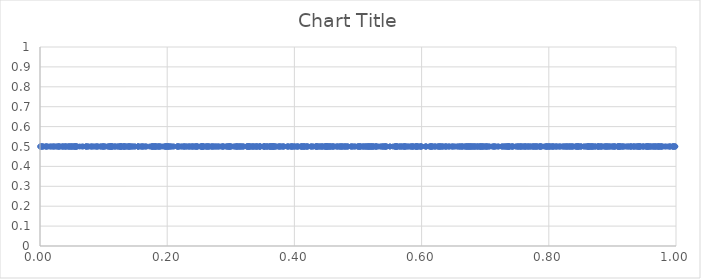
| Category | Series 0 |
|---|---|
| 0.316140277202945 | 0.5 |
| 0.8279138849072092 | 0.5 |
| 0.07573661906130091 | 0.5 |
| 0.7626178492269363 | 0.5 |
| 0.822713779529145 | 0.5 |
| 0.31337007644298664 | 0.5 |
| 0.8470968576617784 | 0.5 |
| 0.10934260965858733 | 0.5 |
| 0.0005317915554668984 | 0.5 |
| 0.14213396767202813 | 0.5 |
| 0.15393947768498406 | 0.5 |
| 0.8318170048011582 | 0.5 |
| 0.4055333368696694 | 0.5 |
| 0.8964725374382734 | 0.5 |
| 0.4124949212350675 | 0.5 |
| 0.6269306486043786 | 0.5 |
| 0.02969664363627822 | 0.5 |
| 0.7960819146087856 | 0.5 |
| 0.48888330379299805 | 0.5 |
| 0.3601915418457101 | 0.5 |
| 0.9725109551866856 | 0.5 |
| 0.6818728144339402 | 0.5 |
| 0.9691249099071847 | 0.5 |
| 0.2399912373602332 | 0.5 |
| 0.3775000497913402 | 0.5 |
| 0.36310135948029165 | 0.5 |
| 0.12678914746605974 | 0.5 |
| 0.36455411007863514 | 0.5 |
| 0.15450205476449252 | 0.5 |
| 0.3524420897235542 | 0.5 |
| 0.7871711699481113 | 0.5 |
| 0.5924314033241872 | 0.5 |
| 0.05385279226747142 | 0.5 |
| 0.3605053975590752 | 0.5 |
| 0.36723770806968437 | 0.5 |
| 0.696950930217932 | 0.5 |
| 0.8257572212418393 | 0.5 |
| 0.9781356905621928 | 0.5 |
| 0.5736519106770857 | 0.5 |
| 0.615224037936145 | 0.5 |
| 0.8824328500503711 | 0.5 |
| 0.03967489604485075 | 0.5 |
| 0.997676399623543 | 0.5 |
| 0.9113212070997144 | 0.5 |
| 0.33393525319278883 | 0.5 |
| 0.1538942341062821 | 0.5 |
| 0.25533681599372426 | 0.5 |
| 0.3290314769214262 | 0.5 |
| 0.45127129400800037 | 0.5 |
| 0.36130529424438496 | 0.5 |
| 0.9227691645608844 | 0.5 |
| 0.29874201656155874 | 0.5 |
| 0.5855418560036731 | 0.5 |
| 0.3964047594638409 | 0.5 |
| 0.3620487057161199 | 0.5 |
| 0.46690113072019823 | 0.5 |
| 0.1256167879357144 | 0.5 |
| 0.3660863616125365 | 0.5 |
| 0.9169181905783852 | 0.5 |
| 0.6689538304348907 | 0.5 |
| 0.17668724219167276 | 0.5 |
| 0.5972588871614944 | 0.5 |
| 0.9242102633956718 | 0.5 |
| 0.8778800101147995 | 0.5 |
| 0.16225232621905306 | 0.5 |
| 0.48236317181117483 | 0.5 |
| 0.9568267495728185 | 0.5 |
| 0.5781733888205093 | 0.5 |
| 0.13792655113744867 | 0.5 |
| 0.8289456576640143 | 0.5 |
| 0.6585463274409855 | 0.5 |
| 0.747861843408552 | 0.5 |
| 0.7669690341061742 | 0.5 |
| 0.67327608221354 | 0.5 |
| 0.3509346573340577 | 0.5 |
| 0.7650400081383985 | 0.5 |
| 0.09573186216346197 | 0.5 |
| 0.7518797017340856 | 0.5 |
| 0.021407270458848382 | 0.5 |
| 0.05630687909899246 | 0.5 |
| 0.6141088450486518 | 0.5 |
| 0.14088131678265492 | 0.5 |
| 0.577751396331167 | 0.5 |
| 0.7324984228716216 | 0.5 |
| 0.6291284639585224 | 0.5 |
| 0.8791205211985628 | 0.5 |
| 0.6789180747003921 | 0.5 |
| 0.36755625615616294 | 0.5 |
| 0.8101696192863093 | 0.5 |
| 0.6952028399417156 | 0.5 |
| 0.7998749369911501 | 0.5 |
| 0.612051724857891 | 0.5 |
| 0.46791054609981264 | 0.5 |
| 0.5392998957609471 | 0.5 |
| 0.10670329086302799 | 0.5 |
| 0.03230615607682141 | 0.5 |
| 0.7260658541931262 | 0.5 |
| 0.7374358839612665 | 0.5 |
| 0.5548251859264313 | 0.5 |
| 0.7069484751853464 | 0.5 |
| 0.591345463056026 | 0.5 |
| 0.3156931400315667 | 0.5 |
| 0.3412863963736914 | 0.5 |
| 0.8070580480719562 | 0.5 |
| 0.4914526581531925 | 0.5 |
| 0.2978107410566557 | 0.5 |
| 0.2936695657990688 | 0.5 |
| 0.479790614515731 | 0.5 |
| 0.4273826430607265 | 0.5 |
| 0.660850744379741 | 0.5 |
| 0.5646519809031596 | 0.5 |
| 0.34682167615578174 | 0.5 |
| 0.4608002217970881 | 0.5 |
| 0.20539378781228623 | 0.5 |
| 0.8661630510819142 | 0.5 |
| 0.3953806515226381 | 0.5 |
| 0.18177433936542875 | 0.5 |
| 0.433909954834803 | 0.5 |
| 0.17691131314909303 | 0.5 |
| 0.5912143396869772 | 0.5 |
| 0.6790502572425086 | 0.5 |
| 0.17243152791313143 | 0.5 |
| 0.5662936591502048 | 0.5 |
| 0.6530799497054955 | 0.5 |
| 0.7966665848473953 | 0.5 |
| 0.23437793290806364 | 0.5 |
| 0.9488258659349992 | 0.5 |
| 0.9151100312807979 | 0.5 |
| 0.5576650083839816 | 0.5 |
| 0.882983579485707 | 0.5 |
| 0.12154514001030403 | 0.5 |
| 0.11386585192256515 | 0.5 |
| 0.20446482674864186 | 0.5 |
| 0.8994960508437626 | 0.5 |
| 0.08522996803920102 | 0.5 |
| 0.2635528120506664 | 0.5 |
| 0.27933691404995964 | 0.5 |
| 0.08747818626609805 | 0.5 |
| 0.10259236208085509 | 0.5 |
| 0.6053917582607868 | 0.5 |
| 0.371240740135095 | 0.5 |
| 0.8166180188212842 | 0.5 |
| 0.6069228591733911 | 0.5 |
| 0.8360296935313187 | 0.5 |
| 0.13354431827767532 | 0.5 |
| 0.185329026753559 | 0.5 |
| 0.3951832068648554 | 0.5 |
| 0.42999899665993346 | 0.5 |
| 0.6284893106300841 | 0.5 |
| 0.17736118918046573 | 0.5 |
| 0.24358657732450328 | 0.5 |
| 0.8617259034832137 | 0.5 |
| 0.4111680304997748 | 0.5 |
| 0.904595455386175 | 0.5 |
| 0.887741511756658 | 0.5 |
| 0.3830320481648861 | 0.5 |
| 0.9168479667278027 | 0.5 |
| 0.774988390187212 | 0.5 |
| 0.5042257363978759 | 0.5 |
| 0.14903672058523687 | 0.5 |
| 0.4538086269268192 | 0.5 |
| 0.9682288455977281 | 0.5 |
| 0.7203172232217582 | 0.5 |
| 0.11182944061130384 | 0.5 |
| 0.24605716974904568 | 0.5 |
| 0.46959948266571183 | 0.5 |
| 0.9124236630319756 | 0.5 |
| 0.9666059256728139 | 0.5 |
| 0.22978069696937264 | 0.5 |
| 0.5591237130470653 | 0.5 |
| 0.7438777080376362 | 0.5 |
| 0.31959377128753963 | 0.5 |
| 0.38118384860600396 | 0.5 |
| 0.05437687177769657 | 0.5 |
| 0.04843445096670518 | 0.5 |
| 0.1971240276491587 | 0.5 |
| 0.516219010709172 | 0.5 |
| 0.5363404481617712 | 0.5 |
| 0.44913774485276325 | 0.5 |
| 0.47906001972383494 | 0.5 |
| 0.5686437681955675 | 0.5 |
| 0.026661896115045436 | 0.5 |
| 0.25284699319672077 | 0.5 |
| 0.010029161423310673 | 0.5 |
| 0.9973909648196548 | 0.5 |
| 0.13573011931906787 | 0.5 |
| 0.7788188194291551 | 0.5 |
| 0.890603009700622 | 0.5 |
| 0.6885428647358148 | 0.5 |
| 0.5325888677255436 | 0.5 |
| 0.47504083521473095 | 0.5 |
| 0.7005563068936658 | 0.5 |
| 0.2878504071984148 | 0.5 |
| 0.5109727022899717 | 0.5 |
| 0.09019701218086529 | 0.5 |
| 0.5009855533035981 | 0.5 |
| 0.567460471156036 | 0.5 |
| 0.9655591100673394 | 0.5 |
| 0.5432780068324927 | 0.5 |
| 0.0759904898881344 | 0.5 |
| 0.7981756856362207 | 0.5 |
| 0.06230865624371762 | 0.5 |
| 0.2271772520274663 | 0.5 |
| 0.8434453180996347 | 0.5 |
| 0.8035566281079249 | 0.5 |
| 0.3793941150720944 | 0.5 |
| 0.9721730342241098 | 0.5 |
| 0.19517414076173878 | 0.5 |
| 0.45168000256443896 | 0.5 |
| 0.36655227107460164 | 0.5 |
| 0.5648936469778881 | 0.5 |
| 0.054738096291129246 | 0.5 |
| 0.11187864608645648 | 0.5 |
| 0.3636568328319306 | 0.5 |
| 0.6753131502282518 | 0.5 |
| 0.9718046303355279 | 0.5 |
| 0.18027273102541608 | 0.5 |
| 0.2322436193639641 | 0.5 |
| 0.04555509438477778 | 0.5 |
| 0.8739809895687881 | 0.5 |
| 0.39689181687767416 | 0.5 |
| 0.41004565207273536 | 0.5 |
| 0.353882408702347 | 0.5 |
| 0.1104497366530478 | 0.5 |
| 0.9949201838676913 | 0.5 |
| 0.7695929208059483 | 0.5 |
| 0.9340137165224598 | 0.5 |
| 0.7792491616736487 | 0.5 |
| 0.27662998260195737 | 0.5 |
| 0.09007322600079604 | 0.5 |
| 0.2558528983058712 | 0.5 |
| 0.7717517681351032 | 0.5 |
| 0.732556472379286 | 0.5 |
| 0.15798762103831276 | 0.5 |
| 0.22685877771553697 | 0.5 |
| 0.8409454384222769 | 0.5 |
| 0.03651709775038059 | 0.5 |
| 0.9762809202396978 | 0.5 |
| 0.27447926195898453 | 0.5 |
| 0.9297789600405282 | 0.5 |
| 0.2549843367880723 | 0.5 |
| 0.6489778309621204 | 0.5 |
| 0.3251956439102862 | 0.5 |
| 0.7318369034594073 | 0.5 |
| 0.6132890953720375 | 0.5 |
| 0.7894453544786293 | 0.5 |
| 0.6955551969750078 | 0.5 |
| 0.4150780731044358 | 0.5 |
| 0.6723216537432367 | 0.5 |
| 0.19841158118506996 | 0.5 |
| 0.767289870188733 | 0.5 |
| 0.9409231746535831 | 0.5 |
| 0.003523435462028379 | 0.5 |
| 0.44309285759618244 | 0.5 |
| 0.8435182058364197 | 0.5 |
| 0.7006295064520656 | 0.5 |
| 0.0018692736230974116 | 0.5 |
| 0.5612966472762296 | 0.5 |
| 0.4117049188372208 | 0.5 |
| 0.8367424565724454 | 0.5 |
| 0.8058549634088027 | 0.5 |
| 0.6833418611031782 | 0.5 |
| 0.7023926120156478 | 0.5 |
| 0.45259652057550637 | 0.5 |
| 0.9426826055066293 | 0.5 |
| 0.5227848802645618 | 0.5 |
| 0.7706080341628062 | 0.5 |
| 0.4374893059187981 | 0.5 |
| 0.010882435151053693 | 0.5 |
| 0.8897505034411495 | 0.5 |
| 0.1319298035868781 | 0.5 |
| 0.11462385764754279 | 0.5 |
| 0.05745548047257154 | 0.5 |
| 0.9206031566650251 | 0.5 |
| 0.7364658583821885 | 0.5 |
| 0.17804470803185213 | 0.5 |
| 0.6765115564208252 | 0.5 |
| 0.9544233294725676 | 0.5 |
| 0.7060426436526935 | 0.5 |
| 0.47392230665983825 | 0.5 |
| 0.357005146770056 | 0.5 |
| 0.19738562575561225 | 0.5 |
| 0.2995311442119828 | 0.5 |
| 0.6422675811546292 | 0.5 |
| 0.12963382785169542 | 0.5 |
| 0.48382543243173126 | 0.5 |
| 0.5287606387741778 | 0.5 |
| 0.29581899387109867 | 0.5 |
| 0.5128861243604853 | 0.5 |
| 0.36594491340307844 | 0.5 |
| 0.9431452956477482 | 0.5 |
| 0.4768729389122992 | 0.5 |
| 0.23875929426965448 | 0.5 |
| 0.4751296996094133 | 0.5 |
| 0.11250361268117459 | 0.5 |
| 0.41454695548132536 | 0.5 |
| 0.24003011289041598 | 0.5 |
| 0.16279918068976873 | 0.5 |
| 0.11720714795799225 | 0.5 |
| 0.47098129743390094 | 0.5 |
| 0.7507223586433711 | 0.5 |
| 0.13081305397113507 | 0.5 |
| 0.37490806202593774 | 0.5 |
| 0.8670572174341187 | 0.5 |
| 0.0730244338200956 | 0.5 |
| 0.6251174377583888 | 0.5 |
| 0.7857018884016823 | 0.5 |
| 0.8775943955829213 | 0.5 |
| 0.6809414388790489 | 0.5 |
| 0.05219473108009365 | 0.5 |
| 0.507086485362239 | 0.5 |
| 0.5237284620616207 | 0.5 |
| 0.9556883839429868 | 0.5 |
| 0.7877269523980381 | 0.5 |
| 0.6268289488610428 | 0.5 |
| 0.1094158696131512 | 0.5 |
| 0.4101993475065703 | 0.5 |
| 0.8315842226872262 | 0.5 |
| 0.7171634489153864 | 0.5 |
| 0.33534978453458797 | 0.5 |
| 0.12380756074044985 | 0.5 |
| 0.3779569079036612 | 0.5 |
| 0.9130879104899315 | 0.5 |
| 0.6147364601637778 | 0.5 |
| 0.5436797469555968 | 0.5 |
| 0.5224528605830396 | 0.5 |
| 0.22304553582778208 | 0.5 |
| 0.05585119006408945 | 0.5 |
| 0.9950234366811046 | 0.5 |
| 0.20082118868887544 | 0.5 |
| 0.8685541951676776 | 0.5 |
| 0.6475454994433284 | 0.5 |
| 0.18225400315286788 | 0.5 |
| 0.9022842071603825 | 0.5 |
| 0.5444888919645653 | 0.5 |
| 0.9986922630739183 | 0.5 |
| 0.2945660310203435 | 0.5 |
| 0.36214109265428107 | 0.5 |
| 0.13987916227150643 | 0.5 |
| 0.4725917003837471 | 0.5 |
| 0.9756665497942039 | 0.5 |
| 0.25417839534662023 | 0.5 |
| 0.6342607824219738 | 0.5 |
| 0.047013893880615276 | 0.5 |
| 0.8968308935220303 | 0.5 |
| 0.009457951995998415 | 0.5 |
| 0.3106012162400632 | 0.5 |
| 0.3252141394996444 | 0.5 |
| 0.07969457426846405 | 0.5 |
| 0.3903295640733685 | 0.5 |
| 0.6845024536712324 | 0.5 |
| 0.39343144482681724 | 0.5 |
| 0.957737446356155 | 0.5 |
| 0.4737111795613128 | 0.5 |
| 0.6895906760380528 | 0.5 |
| 0.12534529924516213 | 0.5 |
| 0.20852638064632578 | 0.5 |
| 0.2016626366672779 | 0.5 |
| 0.7824317474433724 | 0.5 |
| 0.5256456403951164 | 0.5 |
| 0.5987635616622865 | 0.5 |
| 0.8485257280089122 | 0.5 |
| 0.5197171542844282 | 0.5 |
| 0.8432211050342873 | 0.5 |
| 0.18205826478989395 | 0.5 |
| 0.21738135422478455 | 0.5 |
| 0.21597629229433013 | 0.5 |
| 0.01665574370557743 | 0.5 |
| 0.574850860606657 | 0.5 |
| 0.012717600016952102 | 0.5 |
| 0.7637231150425066 | 0.5 |
| 0.42049142667674266 | 0.5 |
| 0.03677574097195069 | 0.5 |
| 0.8677308622452121 | 0.5 |
| 0.29154224687816754 | 0.5 |
| 0.7929597465123112 | 0.5 |
| 0.6689346683040283 | 0.5 |
| 0.9039354960510008 | 0.5 |
| 0.8614855972829443 | 0.5 |
| 0.6607823786637489 | 0.5 |
| 0.960971995391843 | 0.5 |
| 0.022724627774075246 | 0.5 |
| 0.9536010667504732 | 0.5 |
| 0.4336695072886073 | 0.5 |
| 0.00567768030934368 | 0.5 |
| 0.34351036840774396 | 0.5 |
| 0.3056933774449079 | 0.5 |
| 0.17625893527338277 | 0.5 |
| 0.07292316377851726 | 0.5 |
| 0.3902958754251744 | 0.5 |
| 0.26559009765746544 | 0.5 |
| 0.38964720087830185 | 0.5 |
| 0.8261718840102028 | 0.5 |
| 0.8590479588319061 | 0.5 |
| 0.9740641201424202 | 0.5 |
| 0.000542940953940585 | 0.5 |
| 0.13302336057132613 | 0.5 |
| 0.7427954997924764 | 0.5 |
| 0.7805619582323498 | 0.5 |
| 0.3121951679690973 | 0.5 |
| 0.6883191072536679 | 0.5 |
| 0.2034725466620051 | 0.5 |
| 0.27035074954992766 | 0.5 |
| 0.21625593721880043 | 0.5 |
| 0.9821419539732399 | 0.5 |
| 0.8025724843114994 | 0.5 |
| 0.28685622363330576 | 0.5 |
| 0.8594142013524038 | 0.5 |
| 0.6635116809416659 | 0.5 |
| 0.27059031196686 | 0.5 |
| 0.7976303072279542 | 0.5 |
| 0.6966281565879382 | 0.5 |
| 0.9908394204667579 | 0.5 |
| 0.6780185035228592 | 0.5 |
| 0.252792671889395 | 0.5 |
| 0.14908447106793343 | 0.5 |
| 0.8631869908817871 | 0.5 |
| 0.9842778848090014 | 0.5 |
| 0.5301311945071031 | 0.5 |
| 0.36851458620298616 | 0.5 |
| 0.9269824683853033 | 0.5 |
| 0.8724359242888429 | 0.5 |
| 0.13196367706269663 | 0.5 |
| 0.6207514858482324 | 0.5 |
| 0.33157723277029294 | 0.5 |
| 0.028600947433907398 | 0.5 |
| 0.4903086009771441 | 0.5 |
| 0.9026339747066547 | 0.5 |
| 0.7385045469378068 | 0.5 |
| 0.5136653441654301 | 0.5 |
| 0.1845245329039792 | 0.5 |
| 0.4488823782158753 | 0.5 |
| 0.6443471921361953 | 0.5 |
| 0.674288645490064 | 0.5 |
| 0.20267012155442043 | 0.5 |
| 0.5032873972924795 | 0.5 |
| 0.5155572646944955 | 0.5 |
| 0.05095611198299599 | 0.5 |
| 0.18594618654686368 | 0.5 |
| 0.5733294625650402 | 0.5 |
| 0.4520563585018459 | 0.5 |
| 0.8913930222413581 | 0.5 |
| 0.12715759683095806 | 0.5 |
| 0.3645939137424906 | 0.5 |
| 0.9033796649548892 | 0.5 |
| 0.11805303631234876 | 0.5 |
| 0.7861488313087347 | 0.5 |
| 0.8336134119256122 | 0.5 |
| 0.1784888124095484 | 0.5 |
| 0.6775469120565247 | 0.5 |
| 0.3169129834988734 | 0.5 |
| 0.356745474676358 | 0.5 |
| 0.480421974865778 | 0.5 |
| 0.1109169569563766 | 0.5 |
| 0.5258259055178699 | 0.5 |
| 0.8223144015538953 | 0.5 |
| 0.48878353685489584 | 0.5 |
| 0.2666707917657145 | 0.5 |
| 0.8883791863746662 | 0.5 |
| 0.9406072456576429 | 0.5 |
| 0.5832743394927776 | 0.5 |
| 0.8642442213886772 | 0.5 |
| 0.40401170129315833 | 0.5 |
| 0.7341668273865775 | 0.5 |
| 0.34611001097350835 | 0.5 |
| 0.6976171826911048 | 0.5 |
| 0.1878310414212594 | 0.5 |
| 0.861797804852813 | 0.5 |
| 0.2011735891818599 | 0.5 |
| 0.815643494849891 | 0.5 |
| 0.6724053222578775 | 0.5 |
| 0.25534922042303454 | 0.5 |
| 0.8382218648312287 | 0.5 |
| 0.6157257347398405 | 0.5 |
| 0.5593717891747976 | 0.5 |
| 0.9118207874005462 | 0.5 |
| 0.9901767481316952 | 0.5 |
| 0.9693948827883279 | 0.5 |
| 0.817810318357888 | 0.5 |
| 0.5039544971669332 | 0.5 |
| 0.45127295329711425 | 0.5 |
| 0.7001829989669623 | 0.5 |
| 0.42575806316747977 | 0.5 |
| 0.45648203262024356 | 0.5 |
| 0.043658608374677055 | 0.5 |
| 0.9584106085697875 | 0.5 |
| 0.4411839678202326 | 0.5 |
| 0.281511922315442 | 0.5 |
| 0.0404876073016609 | 0.5 |
| 0.6512301424383723 | 0.5 |
| 0.6813953737550204 | 0.5 |
| 0.0399933223615172 | 0.5 |
| 0.24784439087371568 | 0.5 |
| 0.016121842888231708 | 0.5 |
| 0.1427430325439062 | 0.5 |
| 0.8127287420896371 | 0.5 |
| 0.1759902993408471 | 0.5 |
| 0.2403974874419883 | 0.5 |
| 0.2861128365159996 | 0.5 |
| 0.14364009943903988 | 0.5 |
| 0.8005931210220294 | 0.5 |
| 0.5809809031193921 | 0.5 |
| 0.30807823389610633 | 0.5 |
| 0.8618136235122765 | 0.5 |
| 0.4530273882781376 | 0.5 |
| 0.4154159175707236 | 0.5 |
| 0.9377474361477578 | 0.5 |
| 0.8055698936209067 | 0.5 |
| 0.2549022946333902 | 0.5 |
| 0.4717788681127042 | 0.5 |
| 0.6605532299500049 | 0.5 |
| 0.4842745229986868 | 0.5 |
| 0.5179061004618805 | 0.5 |
| 0.4490954263875456 | 0.5 |
| 0.9628316518479614 | 0.5 |
| 0.9639022001613513 | 0.5 |
| 0.7027742153233655 | 0.5 |
| 0.12535467463246353 | 0.5 |
| 0.5401271992489679 | 0.5 |
| 0.7156108263061361 | 0.5 |
| 0.08824641566307789 | 0.5 |
| 0.9950367898230145 | 0.5 |
| 0.4360108588550231 | 0.5 |
| 0.4361265215588682 | 0.5 |
| 0.8196595200257385 | 0.5 |
| 0.31284439419912236 | 0.5 |
| 0.49502353881851757 | 0.5 |
| 0.5585007865713417 | 0.5 |
| 0.7491819239167447 | 0.5 |
| 0.8506043389081751 | 0.5 |
| 0.5357831144891186 | 0.5 |
| 0.12825926693683887 | 0.5 |
| 0.9399628448140908 | 0.5 |
| 0.32803996431447613 | 0.5 |
| 0.7368410345390142 | 0.5 |
| 0.49996529479750595 | 0.5 |
| 0.32883815765917457 | 0.5 |
| 0.9966540570613032 | 0.5 |
| 0.27725691264172037 | 0.5 |
| 0.6426971454443089 | 0.5 |
| 0.019026104638370622 | 0.5 |
| 0.34498576290907934 | 0.5 |
| 0.542498704385789 | 0.5 |
| 0.4501192848525517 | 0.5 |
| 0.9288514831717757 | 0.5 |
| 0.23667369705640107 | 0.5 |
| 0.24683478763538813 | 0.5 |
| 0.7551482062656539 | 0.5 |
| 0.06796582938944895 | 0.5 |
| 0.9443236075291223 | 0.5 |
| 0.3099575601022373 | 0.5 |
| 0.1992153862086259 | 0.5 |
| 0.2622762360169639 | 0.5 |
| 0.9503144336054367 | 0.5 |
| 0.9759938662995388 | 0.5 |
| 0.9645187381678588 | 0.5 |
| 0.8585285943529524 | 0.5 |
| 0.7428150298038544 | 0.5 |
| 0.5862081664831009 | 0.5 |
| 0.3821826990271038 | 0.5 |
| 0.48177719125239826 | 0.5 |
| 0.3389609236918194 | 0.5 |
| 0.5688526217182813 | 0.5 |
| 0.34557233221835915 | 0.5 |
| 0.3752284768147648 | 0.5 |
| 0.9786992427787252 | 0.5 |
| 0.8701824638041783 | 0.5 |
| 0.8466675536974719 | 0.5 |
| 0.25528878753184314 | 0.5 |
| 0.9088517060441906 | 0.5 |
| 0.29663735741973396 | 0.5 |
| 0.7135057573921985 | 0.5 |
| 0.9727956640548173 | 0.5 |
| 0.05718010676931096 | 0.5 |
| 0.9104043410739782 | 0.5 |
| 0.6714003657505474 | 0.5 |
| 0.2943446387267066 | 0.5 |
| 0.12733945537568347 | 0.5 |
| 0.42598751872957696 | 0.5 |
| 0.279999644357978 | 0.5 |
| 0.80049257618774 | 0.5 |
| 0.45101337838115574 | 0.5 |
| 0.30977627618302195 | 0.5 |
| 0.5604048182819867 | 0.5 |
| 0.9528285195150307 | 0.5 |
| 0.30563544662265474 | 0.5 |
| 0.9871609396073479 | 0.5 |
| 0.9364730783501634 | 0.5 |
| 0.37612178369974847 | 0.5 |
| 0.45695441133049297 | 0.5 |
| 0.8623787530994658 | 0.5 |
| 0.8782359586277667 | 0.5 |
| 0.5175592591853772 | 0.5 |
| 0.8694359268554798 | 0.5 |
| 0.30144978339010653 | 0.5 |
| 0.136656905009915 | 0.5 |
| 0.9427142682324938 | 0.5 |
| 0.8062642716969768 | 0.5 |
| 0.049803526162151335 | 0.5 |
| 0.8807232740422994 | 0.5 |
| 0.7590215237639973 | 0.5 |
| 0.460414446344774 | 0.5 |
| 0.1612074275432619 | 0.5 |
| 0.2563751573631461 | 0.5 |
| 0.571847479815835 | 0.5 |
| 0.4490807746717145 | 0.5 |
| 0.6206892348511307 | 0.5 |
| 0.09874683396995099 | 0.5 |
| 0.1962794304207608 | 0.5 |
| 0.7358766882006063 | 0.5 |
| 0.599265712660927 | 0.5 |
| 0.36689443588963155 | 0.5 |
| 0.46643788458489743 | 0.5 |
| 0.5078476466515423 | 0.5 |
| 0.861742236798262 | 0.5 |
| 0.1814161162502631 | 0.5 |
| 0.3568475123810497 | 0.5 |
| 0.7593594487017141 | 0.5 |
| 0.46149078069264116 | 0.5 |
| 0.8461477149065413 | 0.5 |
| 0.40204067801241294 | 0.5 |
| 0.20109054029594597 | 0.5 |
| 0.6169636519112254 | 0.5 |
| 0.8819666999248547 | 0.5 |
| 0.5903071784316392 | 0.5 |
| 0.46323121463156236 | 0.5 |
| 0.6264358627501254 | 0.5 |
| 0.7570716954806309 | 0.5 |
| 0.9545685513987864 | 0.5 |
| 0.13979194332906442 | 0.5 |
| 0.09678310102746612 | 0.5 |
| 0.167370003404001 | 0.5 |
| 0.5753188212306872 | 0.5 |
| 0.5936049446809027 | 0.5 |
| 0.1460013750948279 | 0.5 |
| 0.810988992075109 | 0.5 |
| 0.3531290915171009 | 0.5 |
| 0.6219050781121293 | 0.5 |
| 0.3656215647638654 | 0.5 |
| 0.9082864000622457 | 0.5 |
| 0.8862924637134654 | 0.5 |
| 0.9344083693299922 | 0.5 |
| 0.855471507416243 | 0.5 |
| 0.26540434196440243 | 0.5 |
| 0.8692457346764216 | 0.5 |
| 0.894965338270665 | 0.5 |
| 0.44557891169815267 | 0.5 |
| 0.773301467045456 | 0.5 |
| 0.9087126764048409 | 0.5 |
| 0.7145600478624436 | 0.5 |
| 0.8471288322877059 | 0.5 |
| 0.3199078942712197 | 0.5 |
| 0.025193050940178874 | 0.5 |
| 0.7870910944910237 | 0.5 |
| 0.7391467296097219 | 0.5 |
| 0.18783322842393102 | 0.5 |
| 0.7751574536263924 | 0.5 |
| 0.09083632802539021 | 0.5 |
| 0.5449208830287551 | 0.5 |
| 0.192324524122231 | 0.5 |
| 0.8339134655176463 | 0.5 |
| 0.615841953460827 | 0.5 |
| 0.034767161228520305 | 0.5 |
| 0.43599050493069014 | 0.5 |
| 0.327979479276012 | 0.5 |
| 0.9530772689433317 | 0.5 |
| 0.36258431145771386 | 0.5 |
| 0.18799683699777625 | 0.5 |
| 0.29834081062123563 | 0.5 |
| 0.8452563216725639 | 0.5 |
| 0.9730102501154803 | 0.5 |
| 0.45657914041196934 | 0.5 |
| 0.9560849478474749 | 0.5 |
| 0.3376054498537969 | 0.5 |
| 0.9440597405744916 | 0.5 |
| 0.8773238201705812 | 0.5 |
| 0.670909542254862 | 0.5 |
| 0.663427273538356 | 0.5 |
| 0.08061138808826895 | 0.5 |
| 0.46023456891842596 | 0.5 |
| 0.6390375809911464 | 0.5 |
| 0.09912329760015215 | 0.5 |
| 0.8452312249902798 | 0.5 |
| 0.752433603461801 | 0.5 |
| 0.6570188596958103 | 0.5 |
| 0.040332811524051215 | 0.5 |
| 0.3090337274146492 | 0.5 |
| 0.8556461814306912 | 0.5 |
| 0.8784238669411869 | 0.5 |
| 0.5867508723332818 | 0.5 |
| 0.5580792255340754 | 0.5 |
| 0.1269894239128646 | 0.5 |
| 0.6919743516276968 | 0.5 |
| 0.11139623242407981 | 0.5 |
| 0.4426752390801789 | 0.5 |
| 0.08309682708944666 | 0.5 |
| 0.6002600826089894 | 0.5 |
| 0.7120946732420497 | 0.5 |
| 0.09840897708693919 | 0.5 |
| 0.8282340329710871 | 0.5 |
| 0.8727367535615619 | 0.5 |
| 0.7366292384383597 | 0.5 |
| 0.9325070445569558 | 0.5 |
| 0.7263825766291627 | 0.5 |
| 0.865596899632027 | 0.5 |
| 0.04904107138681768 | 0.5 |
| 0.0027971336390596457 | 0.5 |
| 0.27237805480185695 | 0.5 |
| 0.04545472535573636 | 0.5 |
| 0.9988596910345873 | 0.5 |
| 0.6649184740623468 | 0.5 |
| 0.6331378852032591 | 0.5 |
| 0.6836347865702013 | 0.5 |
| 0.8299228002364695 | 0.5 |
| 0.7623279173563501 | 0.5 |
| 0.8512220860265206 | 0.5 |
| 0.7342637821213915 | 0.5 |
| 0.5924381164277838 | 0.5 |
| 0.5201844035501217 | 0.5 |
| 0.021136971635945634 | 0.5 |
| 0.14015347546621282 | 0.5 |
| 0.19853269805166684 | 0.5 |
| 0.592485887443751 | 0.5 |
| 0.6927900843296313 | 0.5 |
| 0.909966067779536 | 0.5 |
| 0.5167901602805655 | 0.5 |
| 0.6701243581574531 | 0.5 |
| 0.05399022594136471 | 0.5 |
| 0.6927543224556454 | 0.5 |
| 0.9291604261528342 | 0.5 |
| 0.12793574173644562 | 0.5 |
| 0.8768251174694672 | 0.5 |
| 0.8074377171102387 | 0.5 |
| 0.09990898949115778 | 0.5 |
| 0.7423343917378555 | 0.5 |
| 0.5218086740303247 | 0.5 |
| 0.6859619868463702 | 0.5 |
| 0.6376612442862204 | 0.5 |
| 0.3517764882456267 | 0.5 |
| 0.989894739015344 | 0.5 |
| 0.7758777445470093 | 0.5 |
| 0.7417465928337952 | 0.5 |
| 0.29740790837893427 | 0.5 |
| 0.7046955586525111 | 0.5 |
| 0.11050504716090681 | 0.5 |
| 0.3992928214160514 | 0.5 |
| 0.5287975453690635 | 0.5 |
| 0.2976829408557755 | 0.5 |
| 0.5025437949750541 | 0.5 |
| 0.2553444216354679 | 0.5 |
| 0.8343942459403282 | 0.5 |
| 0.8243591574676843 | 0.5 |
| 0.5984262709202344 | 0.5 |
| 0.6375688301932834 | 0.5 |
| 0.7803709345959163 | 0.5 |
| 0.3704831947150955 | 0.5 |
| 0.05690435959918827 | 0.5 |
| 0.9333068156184855 | 0.5 |
| 0.7769400834416339 | 0.5 |
| 0.35736017138381415 | 0.5 |
| 0.11235528255289973 | 0.5 |
| 0.8374199536919396 | 0.5 |
| 0.33362493239832225 | 0.5 |
| 0.4391607539068758 | 0.5 |
| 0.4544375795828546 | 0.5 |
| 0.13259441841961905 | 0.5 |
| 0.42040774323114005 | 0.5 |
| 0.5600138344027378 | 0.5 |
| 0.3672605434654068 | 0.5 |
| 0.4153008546528213 | 0.5 |
| 0.41235864852449056 | 0.5 |
| 0.2067598814152264 | 0.5 |
| 0.9384196827774907 | 0.5 |
| 0.7776672185498072 | 0.5 |
| 0.6486061757715665 | 0.5 |
| 0.5194322410550748 | 0.5 |
| 0.6563339320367192 | 0.5 |
| 0.6174964490852658 | 0.5 |
| 0.5120114607233847 | 0.5 |
| 0.06603959239455603 | 0.5 |
| 0.33066920031763813 | 0.5 |
| 0.10184037067426743 | 0.5 |
| 0.05801159026943925 | 0.5 |
| 0.711175264877197 | 0.5 |
| 0.1543764864416578 | 0.5 |
| 0.11841976422600164 | 0.5 |
| 0.8831358739255476 | 0.5 |
| 0.4062131226621919 | 0.5 |
| 0.5612345894553872 | 0.5 |
| 0.38816522233893735 | 0.5 |
| 0.7028573950724936 | 0.5 |
| 0.893597593370313 | 0.5 |
| 0.7554979636808105 | 0.5 |
| 0.755388382868 | 0.5 |
| 0.5615385162536932 | 0.5 |
| 0.8123298927013262 | 0.5 |
| 0.22664391826786034 | 0.5 |
| 0.44010870712968064 | 0.5 |
| 0.5826369027015704 | 0.5 |
| 0.7972208723781501 | 0.5 |
| 0.34600311954891705 | 0.5 |
| 0.9118783286334562 | 0.5 |
| 0.2997912706467907 | 0.5 |
| 0.47765901713664793 | 0.5 |
| 0.16651933475963798 | 0.5 |
| 0.3186690438567993 | 0.5 |
| 0.3406071360334494 | 0.5 |
| 0.32837692180419864 | 0.5 |
| 0.32560154040003686 | 0.5 |
| 0.029458118033649727 | 0.5 |
| 0.9947850724623674 | 0.5 |
| 0.7562014152022032 | 0.5 |
| 0.4341663425666229 | 0.5 |
| 0.8932903854803989 | 0.5 |
| 0.5715514789632322 | 0.5 |
| 0.009107506804030607 | 0.5 |
| 0.7868153480345658 | 0.5 |
| 0.24560873216327217 | 0.5 |
| 0.28799043124848556 | 0.5 |
| 0.31434980071563134 | 0.5 |
| 0.400713762770342 | 0.5 |
| 0.2882053623548455 | 0.5 |
| 0.6945610084385047 | 0.5 |
| 0.028841324961612402 | 0.5 |
| 0.9291094531343381 | 0.5 |
| 0.9412707708804038 | 0.5 |
| 0.1602496779998287 | 0.5 |
| 0.22022357643232682 | 0.5 |
| 0.95903970640611 | 0.5 |
| 0.7277522213917289 | 0.5 |
| 0.5729946240948239 | 0.5 |
| 0.4344277132349317 | 0.5 |
| 0.1221877370220521 | 0.5 |
| 0.2587286740414497 | 0.5 |
| 0.9604072760597729 | 0.5 |
| 0.7296266575448578 | 0.5 |
| 0.04708266545721973 | 0.5 |
| 0.4192373582268979 | 0.5 |
| 0.1085092162934469 | 0.5 |
| 0.30882159506851037 | 0.5 |
| 0.0559097762406513 | 0.5 |
| 0.9415339696527366 | 0.5 |
| 0.5392182531648126 | 0.5 |
| 0.5084923601304061 | 0.5 |
| 0.8507889312002599 | 0.5 |
| 0.050496670867636206 | 0.5 |
| 0.25254297774698875 | 0.5 |
| 0.10049531302650161 | 0.5 |
| 0.8633051856176363 | 0.5 |
| 0.2189423610759783 | 0.5 |
| 0.8658176839305947 | 0.5 |
| 0.2690230619383295 | 0.5 |
| 0.3406263673512967 | 0.5 |
| 0.44348494762541757 | 0.5 |
| 0.4483829996387211 | 0.5 |
| 0.03576710634158786 | 0.5 |
| 0.41296479744253145 | 0.5 |
| 0.15493009075464248 | 0.5 |
| 0.863413761148906 | 0.5 |
| 0.7139565223701875 | 0.5 |
| 0.5602931771639971 | 0.5 |
| 0.18076221765114686 | 0.5 |
| 0.595474928731321 | 0.5 |
| 0.21054667481019784 | 0.5 |
| 0.63093597660707 | 0.5 |
| 0.9151977408935785 | 0.5 |
| 0.6324369864594415 | 0.5 |
| 0.2628914032720886 | 0.5 |
| 0.22321839063410331 | 0.5 |
| 0.26074643202483594 | 0.5 |
| 0.09432882895165651 | 0.5 |
| 0.44965853639342346 | 0.5 |
| 0.4455214062234326 | 0.5 |
| 0.6381167492480906 | 0.5 |
| 0.5027367263453563 | 0.5 |
| 0.49901184334022286 | 0.5 |
| 0.7208327169141808 | 0.5 |
| 0.4347111130861727 | 0.5 |
| 0.0817251863969366 | 0.5 |
| 0.4950773997471505 | 0.5 |
| 0.8439416998090342 | 0.5 |
| 0.4175690506714488 | 0.5 |
| 0.9008615569023148 | 0.5 |
| 0.33615487682619416 | 0.5 |
| 0.22607927273173067 | 0.5 |
| 0.2338815279746559 | 0.5 |
| 0.550118134784413 | 0.5 |
| 0.6069941416513382 | 0.5 |
| 0.428554403351738 | 0.5 |
| 0.04386506156348868 | 0.5 |
| 0.1892827998366151 | 0.5 |
| 0.1332347480313052 | 0.5 |
| 0.9476931887905544 | 0.5 |
| 0.5942320712735881 | 0.5 |
| 0.23634554144145026 | 0.5 |
| 0.7823877038155476 | 0.5 |
| 0.9181819750397135 | 0.5 |
| 0.7300012487836246 | 0.5 |
| 0.25511990443000887 | 0.5 |
| 0.07239514957912596 | 0.5 |
| 0.9479557898739909 | 0.5 |
| 0.33459884106523463 | 0.5 |
| 0.6310819502800247 | 0.5 |
| 0.5892811303993711 | 0.5 |
| 0.7363865370077577 | 0.5 |
| 0.8897104954466011 | 0.5 |
| 0.6924398658008587 | 0.5 |
| 0.76326466848554 | 0.5 |
| 0.5100146590508674 | 0.5 |
| 0.7364305232603778 | 0.5 |
| 0.3986751189162637 | 0.5 |
| 0.1798554543193156 | 0.5 |
| 0.2713301589757695 | 0.5 |
| 0.5143611889940176 | 0.5 |
| 0.2576727039753408 | 0.5 |
| 0.5015694560851368 | 0.5 |
| 0.6290820348551407 | 0.5 |
| 0.10651907688340723 | 0.5 |
| 0.7608721471606348 | 0.5 |
| 0.0044724300280498674 | 0.5 |
| 0.573089608237696 | 0.5 |
| 0.5420236012040179 | 0.5 |
| 0.4206219627275881 | 0.5 |
| 0.07297505341532529 | 0.5 |
| 0.5283716957109201 | 0.5 |
| 0.45870600964336794 | 0.5 |
| 0.6923863764572128 | 0.5 |
| 0.26418255058500695 | 0.5 |
| 0.27380920623673677 | 0.5 |
| 0.34035484962551343 | 0.5 |
| 0.2165719389462124 | 0.5 |
| 0.9551196935917787 | 0.5 |
| 0.3834263251598683 | 0.5 |
| 0.5232799805434973 | 0.5 |
| 0.5993439963514937 | 0.5 |
| 0.15936268975440238 | 0.5 |
| 0.327460238656447 | 0.5 |
| 0.13935821281574967 | 0.5 |
| 0.5846131627639196 | 0.5 |
| 0.967005567933021 | 0.5 |
| 0.40443312756031136 | 0.5 |
| 0.2617721674081489 | 0.5 |
| 0.9774082393784471 | 0.5 |
| 0.24304972849831719 | 0.5 |
| 0.417124396891557 | 0.5 |
| 0.45601068711369486 | 0.5 |
| 0.23001388092808783 | 0.5 |
| 0.3954790107576567 | 0.5 |
| 0.6140757414632045 | 0.5 |
| 0.6637176409127336 | 0.5 |
| 0.326167746934934 | 0.5 |
| 0.3524110420670368 | 0.5 |
| 0.7522827631240658 | 0.5 |
| 0.6756778368739771 | 0.5 |
| 0.9099052453201288 | 0.5 |
| 0.9085705143380888 | 0.5 |
| 0.34574912992602846 | 0.5 |
| 0.5002811712132275 | 0.5 |
| 0.2546067627839441 | 0.5 |
| 0.8015291507103518 | 0.5 |
| 0.7954062007476604 | 0.5 |
| 0.1982360390580462 | 0.5 |
| 0.9558647269454946 | 0.5 |
| 0.925671480897217 | 0.5 |
| 0.8919737552217354 | 0.5 |
| 0.7683201019877149 | 0.5 |
| 0.32685453992043456 | 0.5 |
| 0.7948850878766965 | 0.5 |
| 0.35301475299751095 | 0.5 |
| 0.2464546593713377 | 0.5 |
| 0.33035169274287124 | 0.5 |
| 0.11243315434355616 | 0.5 |
| 0.4924112379403387 | 0.5 |
| 0.11335954059357645 | 0.5 |
| 0.5424382177536822 | 0.5 |
| 0.6073948314598624 | 0.5 |
| 0.5165440403091549 | 0.5 |
| 0.24759727384251262 | 0.5 |
| 0.5281929430647792 | 0.5 |
| 0.5604181980084142 | 0.5 |
| 0.36950473616023016 | 0.5 |
| 0.5920257048843506 | 0.5 |
| 0.9001354467806265 | 0.5 |
| 0.14583770330030554 | 0.5 |
| 0.35350192994705365 | 0.5 |
| 0.5502688038728917 | 0.5 |
| 0.16501615097043498 | 0.5 |
| 0.6873062357622142 | 0.5 |
| 0.5202501712688409 | 0.5 |
| 0.28380980227102603 | 0.5 |
| 0.24448171596165547 | 0.5 |
| 0.5859402777925525 | 0.5 |
| 0.6670332555361973 | 0.5 |
| 0.030657704926373763 | 0.5 |
| 0.6751845885687772 | 0.5 |
| 0.17484217347354802 | 0.5 |
| 0.5383204921606694 | 0.5 |
| 0.2163030383225173 | 0.5 |
| 0.0023425344173034768 | 0.5 |
| 0.7860911134837063 | 0.5 |